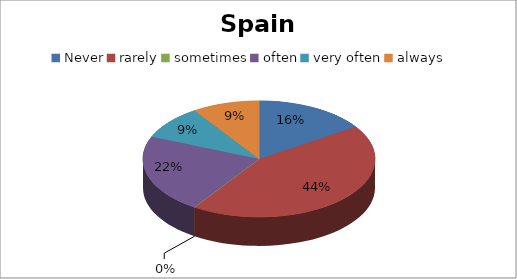
| Category | Series 0 |
|---|---|
| Never | 5 |
| rarely | 14 |
| sometimes | 0 |
| often | 7 |
| very often | 3 |
| always | 3 |